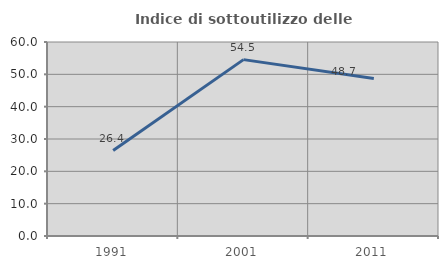
| Category | Indice di sottoutilizzo delle abitazioni  |
|---|---|
| 1991.0 | 26.415 |
| 2001.0 | 54.545 |
| 2011.0 | 48.718 |